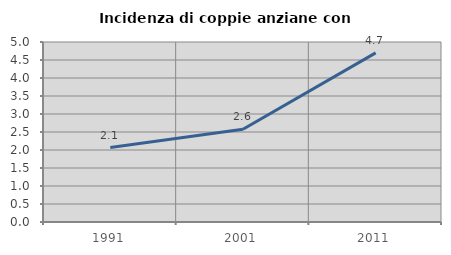
| Category | Incidenza di coppie anziane con figli |
|---|---|
| 1991.0 | 2.067 |
| 2001.0 | 2.576 |
| 2011.0 | 4.697 |